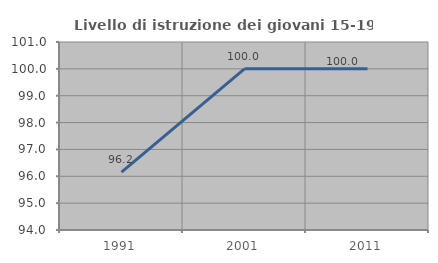
| Category | Livello di istruzione dei giovani 15-19 anni |
|---|---|
| 1991.0 | 96.154 |
| 2001.0 | 100 |
| 2011.0 | 100 |